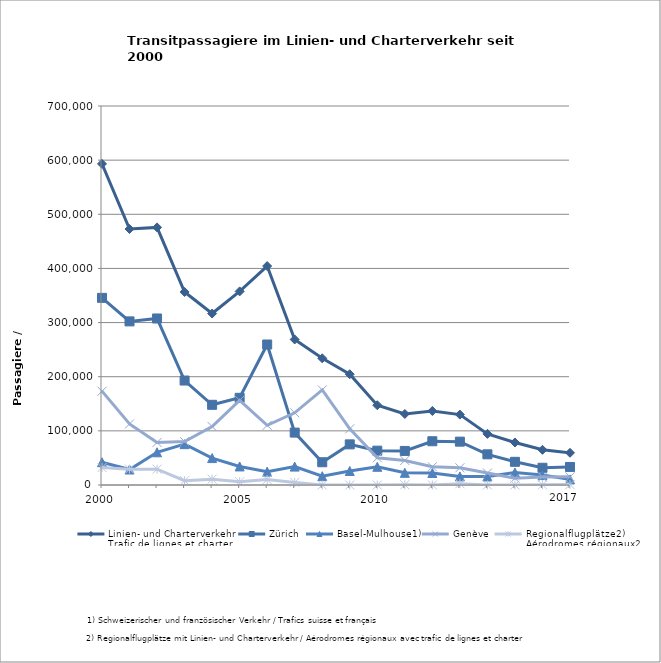
| Category | Linien- und Charterverkehr
Trafic de lignes et charter | Zürich | Basel-Mulhouse1) | Genève | Regionalflugplätze2)
Aérodromes régionaux2) |
|---|---|---|---|---|---|
| 2000.0 | 593150 | 345669 | 42086 | 173210 | 32185 |
| 2001.0 | 472787 | 302154 | 28588 | 112726 | 29319 |
| 2002.0 | 475794 | 307569 | 60403 | 78595 | 29227 |
| 2003.0 | 356524 | 192932 | 75431 | 80168 | 7993 |
| 2004.0 | 316684 | 148132 | 49728 | 108042 | 10782 |
| 2005.0 | 357580 | 161044 | 34282 | 156233 | 6021 |
| 2006.0 | 404358 | 259480 | 24623 | 110244 | 10011 |
| 2007.0 | 268811 | 96765 | 33970 | 133276 | 4800 |
| 2008.0 | 234025 | 42022 | 16318 | 175685 | 0 |
| 2009.0 | 204594 | 75041 | 25838 | 103715 | 0 |
| 2010.0 | 147311 | 63410 | 33634 | 50267 | 0 |
| 2011.0 | 131200 | 62892 | 22482 | 45349 | 477 |
| 2012.0 | 136688 | 80822 | 22206 | 33588 | 72 |
| 2013.0 | 130021 | 80060 | 15820 | 31794 | 2347 |
| 2014.0 | 94412 | 56654 | 15685 | 22020 | 53 |
| 2015.0 | 78525 | 42810 | 23143 | 12475 | 97 |
| 2016.0 | 65016 | 31828 | 18295 | 14589 | 304 |
| 2017.0 | 59503 | 33357 | 10267 | 15025 | 854 |